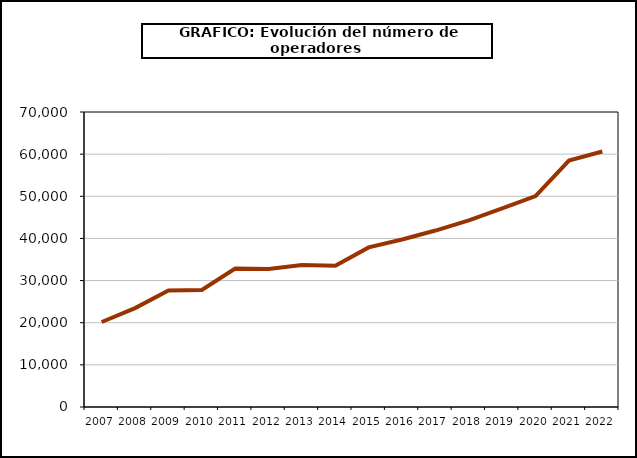
| Category | Operadores (*) |
|---|---|
| 2007.0 | 20171 |
| 2008.0 | 23473 |
| 2009.0 | 27627 |
| 2010.0 | 27767 |
| 2011.0 | 32837 |
| 2012.0 | 32724 |
| 2013.0 | 33704 |
| 2014.0 | 33539 |
| 2015.0 | 37870 |
| 2016.0 | 39744 |
| 2017.0 | 41871 |
| 2018.0 | 44282 |
| 2019.0 | 47108 |
| 2020.0 | 50047 |
| 2021.0 | 58485 |
| 2022.0 | 60621 |